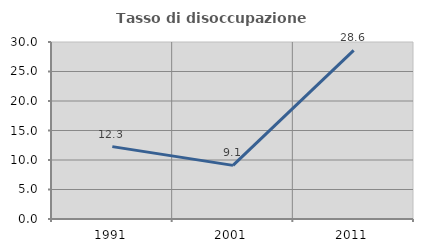
| Category | Tasso di disoccupazione giovanile  |
|---|---|
| 1991.0 | 12.264 |
| 2001.0 | 9.091 |
| 2011.0 | 28.571 |